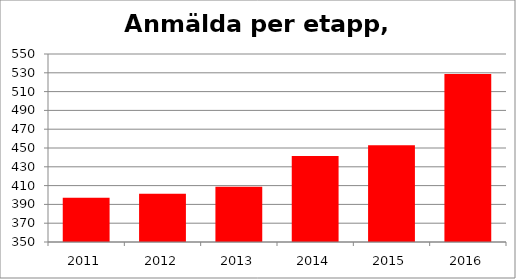
| Category | Medel |
|---|---|
| 2011.0 | 397 |
| 2012.0 | 401.25 |
| 2013.0 | 408.8 |
| 2014.0 | 441.6 |
| 2015.0 | 452.8 |
| 2016.0 | 528.8 |